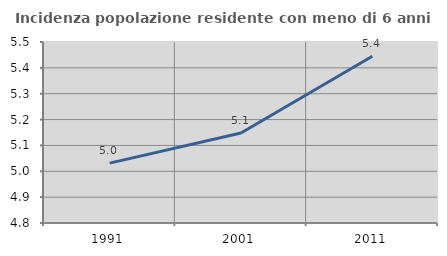
| Category | Incidenza popolazione residente con meno di 6 anni |
|---|---|
| 1991.0 | 5.032 |
| 2001.0 | 5.148 |
| 2011.0 | 5.445 |